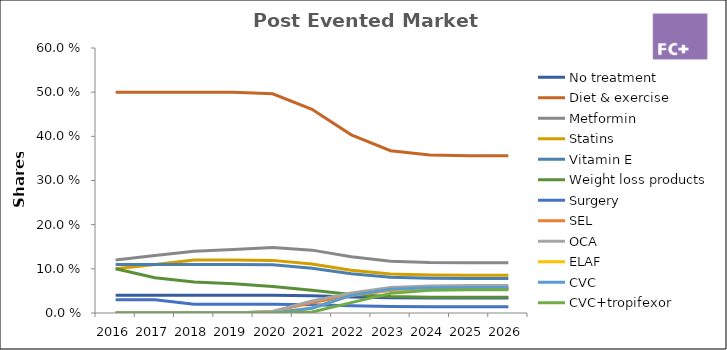
| Category | No treatment | Diet & exercise | Metformin | Statins | Vitamin E | Weight loss products | Surgery | SEL | OCA | ELAF | CVC | CVC+tropifexor |
|---|---|---|---|---|---|---|---|---|---|---|---|---|
| 2016.0 | 0.04 | 0.5 | 0.12 | 0.1 | 0.11 | 0.1 | 0.03 | 0 | 0 | 0 | 0 | 0 |
| 2017.0 | 0.04 | 0.5 | 0.13 | 0.11 | 0.11 | 0.08 | 0.03 | 0 | 0 | 0 | 0 | 0 |
| 2018.0 | 0.04 | 0.5 | 0.14 | 0.12 | 0.11 | 0.07 | 0.02 | 0 | 0 | 0 | 0 | 0 |
| 2019.0 | 0.04 | 0.5 | 0.144 | 0.12 | 0.11 | 0.066 | 0.02 | 0 | 0 | 0 | 0 | 0 |
| 2020.0 | 0.04 | 0.496 | 0.148 | 0.119 | 0.109 | 0.06 | 0.02 | 0.003 | 0.004 | 0 | 0 | 0 |
| 2021.0 | 0.039 | 0.461 | 0.142 | 0.111 | 0.101 | 0.051 | 0.018 | 0.024 | 0.027 | 0.011 | 0.011 | 0.002 |
| 2022.0 | 0.036 | 0.403 | 0.127 | 0.097 | 0.089 | 0.042 | 0.016 | 0.04 | 0.046 | 0.04 | 0.04 | 0.023 |
| 2023.0 | 0.034 | 0.368 | 0.117 | 0.088 | 0.081 | 0.037 | 0.015 | 0.051 | 0.058 | 0.053 | 0.054 | 0.044 |
| 2024.0 | 0.034 | 0.358 | 0.115 | 0.086 | 0.079 | 0.036 | 0.014 | 0.054 | 0.061 | 0.055 | 0.057 | 0.052 |
| 2025.0 | 0.034 | 0.356 | 0.114 | 0.085 | 0.078 | 0.036 | 0.014 | 0.055 | 0.062 | 0.056 | 0.058 | 0.053 |
| 2026.0 | 0.034 | 0.356 | 0.114 | 0.085 | 0.078 | 0.036 | 0.014 | 0.055 | 0.062 | 0.056 | 0.058 | 0.053 |